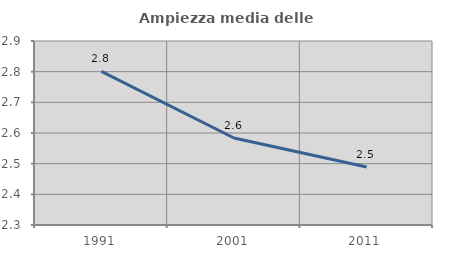
| Category | Ampiezza media delle famiglie |
|---|---|
| 1991.0 | 2.801 |
| 2001.0 | 2.584 |
| 2011.0 | 2.489 |